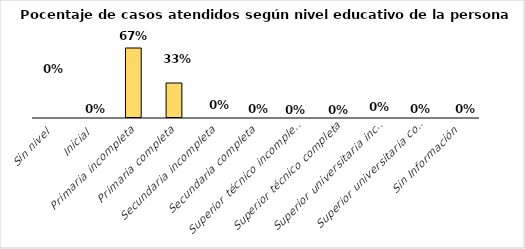
| Category | Series 0 |
|---|---|
| Sin nivel | 0 |
| Inicial | 0 |
| Primaria incompleta | 0.667 |
| Primaria completa | 0.333 |
| Secundaria incompleta | 0 |
| Secundaria completa | 0 |
| Superior técnico incompleta | 0 |
| Superior técnico completa | 0 |
| Superior universitaria incompleta | 0 |
| Superior universitaria completo | 0 |
| Sin Información | 0 |